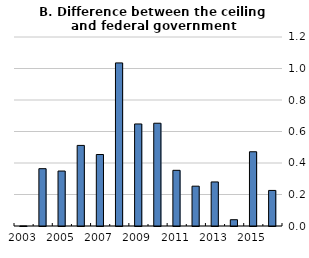
| Category | Ceiling - Expenditures |
|---|---|
| 2003.0 | 0 |
| 2004.0 | 0.364 |
| 2005.0 | 0.349 |
| 2006.0 | 0.512 |
| 2007.0 | 0.454 |
| 2008.0 | 1.035 |
| 2009.0 | 0.648 |
| 2010.0 | 0.652 |
| 2011.0 | 0.354 |
| 2012.0 | 0.253 |
| 2013.0 | 0.28 |
| 2014.0 | 0.04 |
| 2015.0 | 0.471 |
| 2016.0 | 0.226 |